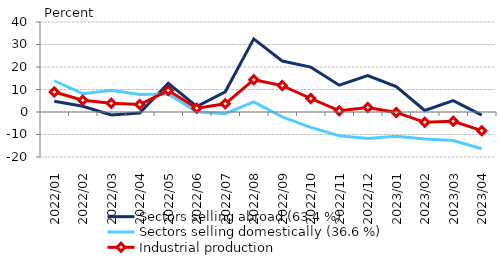
| Category | Sectors selling abroad (63.4 %) | Sectors selling domestically (36.6 %) | Industrial production |
|---|---|---|---|
| 2022-01-01 | 4.82 | 13.888 | 8.861 |
| 2022-02-01 | 2.553 | 8.134 | 5.265 |
| 2022-03-01 | -1.303 | 9.64 | 3.868 |
| 2022-04-01 | -0.497 | 7.786 | 3.3 |
| 2022-05-01 | 12.788 | 7.977 | 9.53 |
| 2022-06-01 | 2.438 | 0.109 | 1.657 |
| 2022-07-01 | 8.978 | -0.739 | 3.622 |
| 2022-08-01 | 32.488 | 4.51 | 14.375 |
| 2022-09-01 | 22.671 | -2.172 | 11.746 |
| 2022-10-01 | 19.944 | -6.823 | 5.999 |
| 2022-11-01 | 11.916 | -10.58 | 0.564 |
| 2022-12-01 | 16.215 | -11.732 | 2.027 |
| 2023-01-01 | 11.326 | -10.817 | -0.198 |
| 2023-02-01 | 0.68 | -11.987 | -4.598 |
| 2023-03-01 | 5.023 | -12.667 | -4.1 |
| 2023-04-01 | -1.374 | -16.33 | -8.3 |